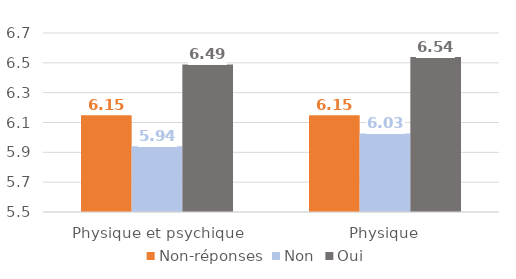
| Category | Non-réponses | Non | Oui |
|---|---|---|---|
| Physique et psychique | 6.148 | 5.941 | 6.489 |
| Physique | 6.148 | 6.026 | 6.539 |